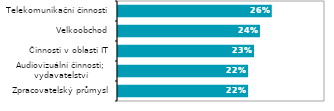
| Category | Series 0 |
|---|---|
| Zpracovatelský průmysl | 0.22 |
| Audiovizuální činnosti; 
vydavatelství  | 0.22 |
| Činnosti v oblasti IT | 0.23 |
| Velkoobchod | 0.24 |
| Telekomunikační činnosti | 0.26 |